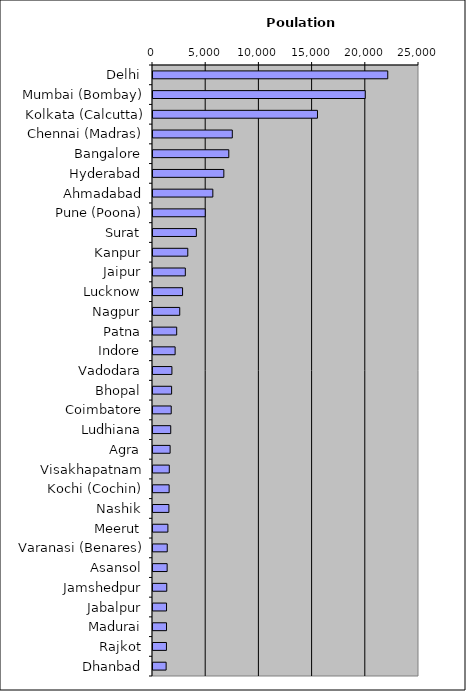
| Category | Series 0 |
|---|---|
| Delhi | 22157 |
| Mumbai (Bombay) | 20041 |
| Kolkata (Calcutta) | 15552 |
| Chennai (Madras) | 7547 |
| Bangalore | 7218 |
| Hyderabad | 6751 |
| Ahmadabad | 5717 |
| Pune (Poona) | 5002 |
| Surat | 4168 |
| Kanpur | 3364 |
| Jaipur | 3131 |
| Lucknow | 2873 |
| Nagpur | 2607 |
| Patna | 2321 |
| Indore | 2173 |
| Vadodara | 1872 |
| Bhopal | 1843 |
| Coimbatore | 1807 |
| Ludhiana | 1760 |
| Agra | 1703 |
| Visakhapatnam | 1625 |
| Kochi (Cochin) | 1610 |
| Nashik | 1588 |
| Meerut | 1494 |
| Varanasi (Benares) | 1432 |
| Asansol | 1423 |
| Jamshedpur | 1387 |
| Jabalpur | 1367 |
| Madurai | 1365 |
| Rajkot | 1357 |
| Dhanbad | 1328 |